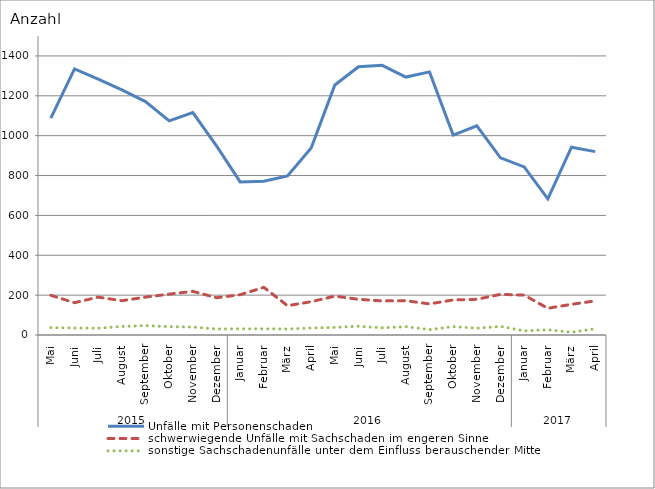
| Category | Unfälle mit Personenschaden | schwerwiegende Unfälle mit Sachschaden im engeren Sinne | sonstige Sachschadenunfälle unter dem Einfluss berauschender Mittel |
|---|---|---|---|
| 0 | 1088 | 199 | 37 |
| 1 | 1335 | 162 | 35 |
| 2 | 1284 | 190 | 34 |
| 3 | 1230 | 172 | 43 |
| 4 | 1171 | 190 | 47 |
| 5 | 1074 | 205 | 42 |
| 6 | 1116 | 219 | 40 |
| 7 | 949 | 187 | 30 |
| 8 | 768 | 202 | 31 |
| 9 | 771 | 239 | 31 |
| 10 | 798 | 147 | 30 |
| 11 | 938 | 167 | 35 |
| 12 | 1254 | 195 | 38 |
| 13 | 1346 | 179 | 44 |
| 14 | 1353 | 171 | 36 |
| 15 | 1294 | 172 | 42 |
| 16 | 1320 | 156 | 27 |
| 17 | 1003 | 176 | 42 |
| 18 | 1049 | 179 | 34 |
| 19 | 889 | 204 | 43 |
| 20 | 843 | 200 | 21 |
| 21 | 683 | 134 | 26 |
| 22 | 942 | 154 | 14 |
| 23 | 920 | 171 | 31 |